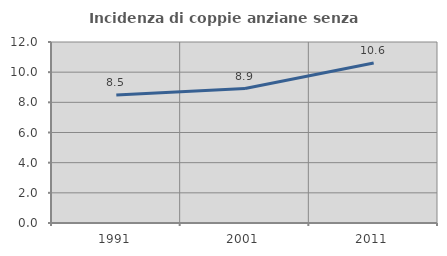
| Category | Incidenza di coppie anziane senza figli  |
|---|---|
| 1991.0 | 8.48 |
| 2001.0 | 8.911 |
| 2011.0 | 10.604 |